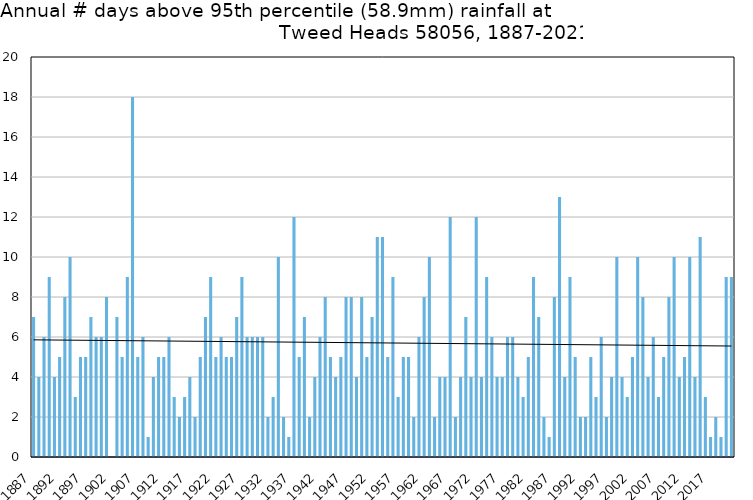
| Category | Annual # days above 95th percentile |
|---|---|
| 1887 | 7 |
| 1888 | 4 |
| 1889 | 6 |
| 1890 | 9 |
| 1891 | 4 |
| 1892 | 5 |
| 1893 | 8 |
| 1894 | 10 |
| 1895 | 3 |
| 1896 | 5 |
| 1897 | 5 |
| 1898 | 7 |
| 1899 | 6 |
| 1900 | 6 |
| 1901 | 8 |
| 1902 | 0 |
| 1903 | 7 |
| 1904 | 5 |
| 1905 | 9 |
| 1906 | 18 |
| 1907 | 5 |
| 1908 | 6 |
| 1909 | 1 |
| 1910 | 4 |
| 1911 | 5 |
| 1912 | 5 |
| 1913 | 6 |
| 1914 | 3 |
| 1915 | 2 |
| 1916 | 3 |
| 1917 | 4 |
| 1918 | 2 |
| 1919 | 5 |
| 1920 | 7 |
| 1921 | 9 |
| 1922 | 5 |
| 1923 | 6 |
| 1924 | 5 |
| 1925 | 5 |
| 1926 | 7 |
| 1927 | 9 |
| 1928 | 6 |
| 1929 | 6 |
| 1930 | 6 |
| 1931 | 6 |
| 1932 | 2 |
| 1933 | 3 |
| 1934 | 10 |
| 1935 | 2 |
| 1936 | 1 |
| 1937 | 12 |
| 1938 | 5 |
| 1939 | 7 |
| 1940 | 2 |
| 1941 | 4 |
| 1942 | 6 |
| 1943 | 8 |
| 1944 | 5 |
| 1945 | 4 |
| 1946 | 5 |
| 1947 | 8 |
| 1948 | 8 |
| 1949 | 4 |
| 1950 | 8 |
| 1951 | 5 |
| 1952 | 7 |
| 1953 | 11 |
| 1954 | 11 |
| 1955 | 5 |
| 1956 | 9 |
| 1957 | 3 |
| 1958 | 5 |
| 1959 | 5 |
| 1960 | 2 |
| 1961 | 6 |
| 1962 | 8 |
| 1963 | 10 |
| 1964 | 2 |
| 1965 | 4 |
| 1966 | 4 |
| 1967 | 12 |
| 1968 | 2 |
| 1969 | 4 |
| 1970 | 7 |
| 1971 | 4 |
| 1972 | 12 |
| 1973 | 4 |
| 1974 | 9 |
| 1975 | 6 |
| 1976 | 4 |
| 1977 | 4 |
| 1978 | 6 |
| 1979 | 6 |
| 1980 | 4 |
| 1981 | 3 |
| 1982 | 5 |
| 1983 | 9 |
| 1984 | 7 |
| 1985 | 2 |
| 1986 | 1 |
| 1987 | 8 |
| 1988 | 13 |
| 1989 | 4 |
| 1990 | 9 |
| 1991 | 5 |
| 1992 | 2 |
| 1993 | 2 |
| 1994 | 5 |
| 1995 | 3 |
| 1996 | 6 |
| 1997 | 2 |
| 1998 | 4 |
| 1999 | 10 |
| 2000 | 4 |
| 2001 | 3 |
| 2002 | 5 |
| 2003 | 10 |
| 2004 | 8 |
| 2005 | 4 |
| 2006 | 6 |
| 2007 | 3 |
| 2008 | 5 |
| 2009 | 8 |
| 2010 | 10 |
| 2011 | 4 |
| 2012 | 5 |
| 2013 | 10 |
| 2014 | 4 |
| 2015 | 11 |
| 2016 | 3 |
| 2017 | 1 |
| 2018 | 2 |
| 2019 | 1 |
| 2020 | 9 |
| 2021 | 9 |